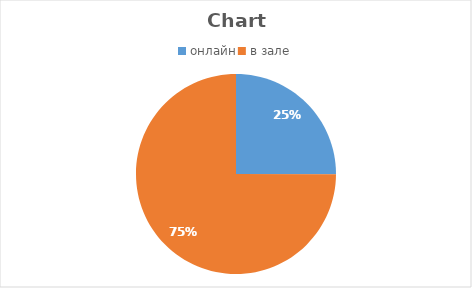
| Category | Series 0 |
|---|---|
| онлайн | 432110 |
| в зале | 1292725 |